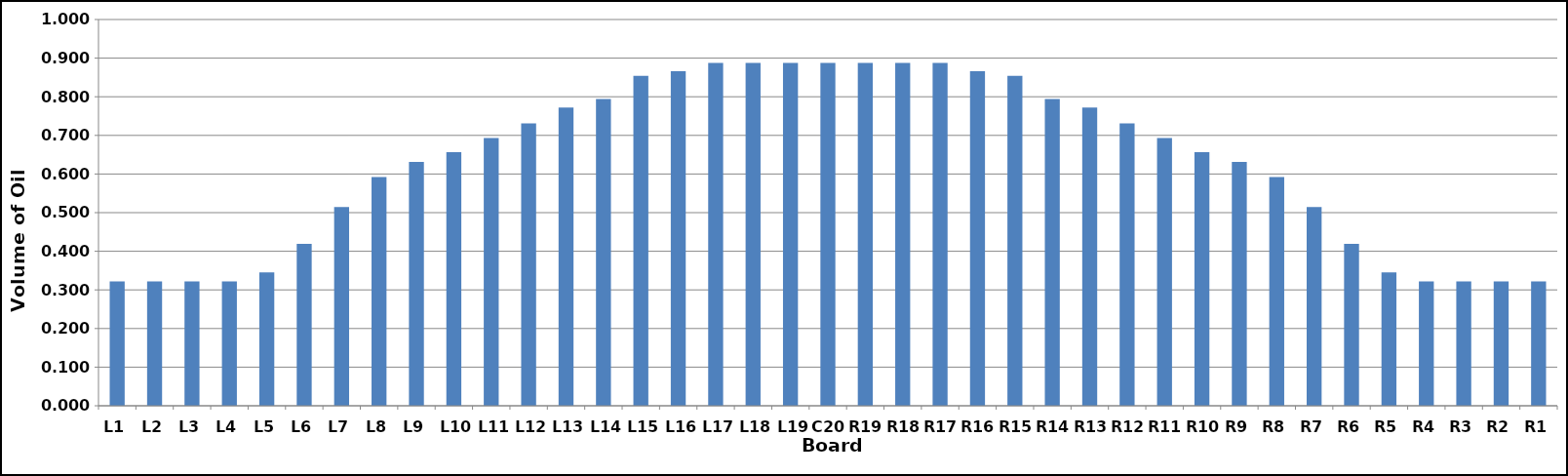
| Category | Series 0 |
|---|---|
| L1 | 0.322 |
| L2 | 0.322 |
| L3 | 0.322 |
| L4 | 0.322 |
| L5 | 0.345 |
| L6 | 0.419 |
| L7 | 0.514 |
| L8 | 0.592 |
| L9 | 0.631 |
| L10 | 0.656 |
| L11 | 0.693 |
| L12 | 0.731 |
| L13 | 0.772 |
| L14 | 0.794 |
| L15 | 0.854 |
| L16 | 0.866 |
| L17 | 0.888 |
| L18 | 0.888 |
| L19 | 0.888 |
| C20 | 0.888 |
| R19 | 0.888 |
| R18 | 0.888 |
| R17 | 0.888 |
| R16 | 0.866 |
| R15 | 0.854 |
| R14 | 0.794 |
| R13 | 0.772 |
| R12 | 0.731 |
| R11 | 0.693 |
| R10 | 0.656 |
| R9 | 0.631 |
| R8 | 0.592 |
| R7 | 0.514 |
| R6 | 0.419 |
| R5 | 0.345 |
| R4 | 0.322 |
| R3 | 0.322 |
| R2 | 0.322 |
| R1 | 0.322 |